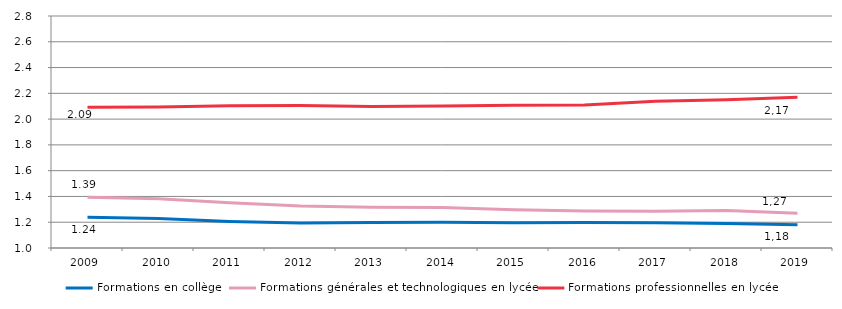
| Category | Formations en collège | Formations générales et technologiques en lycée | Formations professionnelles en lycée |
|---|---|---|---|
| 2009.0 | 1.239 | 1.394 | 2.091 |
| 2010.0 | 1.228 | 1.382 | 2.094 |
| 2011.0 | 1.206 | 1.35 | 2.103 |
| 2012.0 | 1.194 | 1.326 | 2.105 |
| 2013.0 | 1.199 | 1.316 | 2.097 |
| 2014.0 | 1.2 | 1.313 | 2.102 |
| 2015.0 | 1.196 | 1.297 | 2.108 |
| 2016.0 | 1.198 | 1.286 | 2.11 |
| 2017.0 | 1.195 | 1.285 | 2.139 |
| 2018.0 | 1.19 | 1.29 | 2.15 |
| 2019.0 | 1.18 | 1.27 | 2.17 |